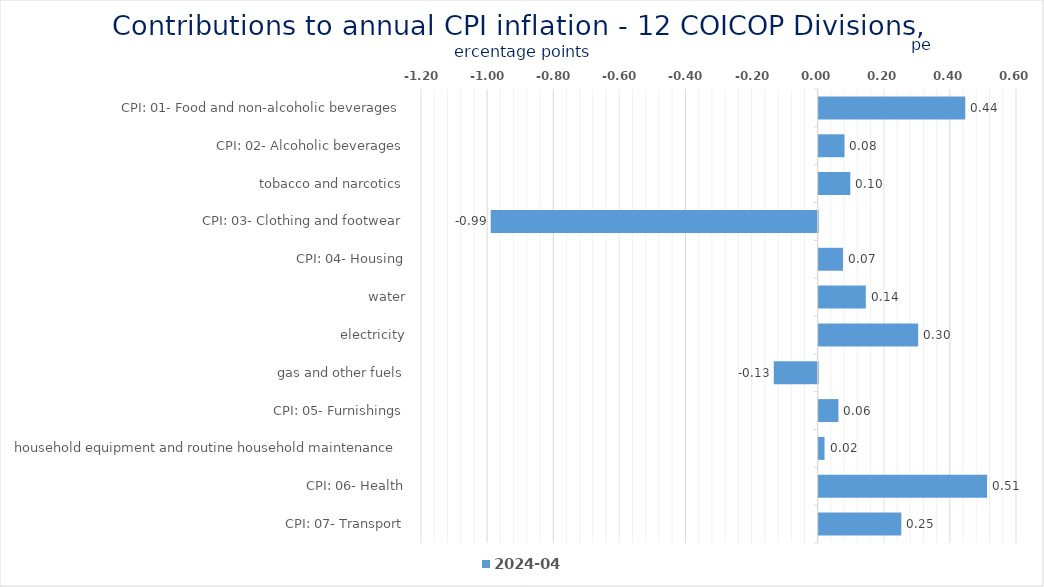
| Category | 2024-04 |
|---|---|
| CPI: 01- Food and non-alcoholic beverages | 0.444 |
| CPI: 02- Alcoholic beverages, tobacco and narcotics | 0.078 |
| CPI: 03- Clothing and footwear | 0.096 |
| CPI: 04- Housing, water, electricity, gas and other fuels | -0.989 |
| CPI: 05- Furnishings, household equipment and routine household maintenance | 0.074 |
| CPI: 06- Health | 0.143 |
| CPI: 07- Transport | 0.301 |
| CPI: 08- Communication | -0.133 |
| CPI: 09- Recreation and culture | 0.06 |
| CPI: 10- Education | 0.018 |
| CPI: 11- Restaurants and hotels | 0.51 |
| CPI: 12- Miscellaneous goods and services | 0.25 |